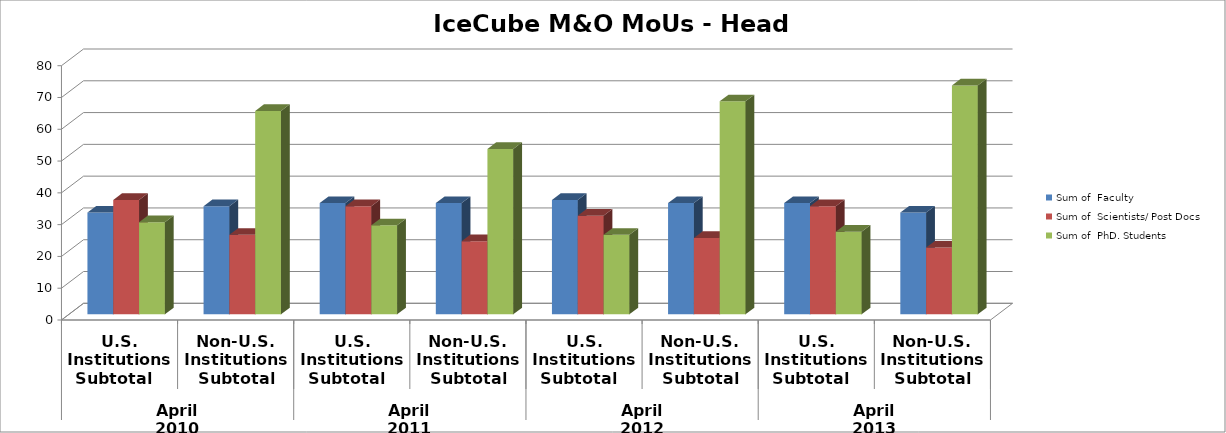
| Category | Sum of  Faculty | Sum of  Scientists/ Post Docs | Sum of  PhD. Students |
|---|---|---|---|
| 0 | 32 | 36 | 29 |
| 1 | 34 | 25 | 64 |
| 2 | 35 | 34 | 28 |
| 3 | 35 | 23 | 52 |
| 4 | 36 | 31 | 25 |
| 5 | 35 | 24 | 67 |
| 6 | 35 | 34 | 26 |
| 7 | 32 | 21 | 72 |